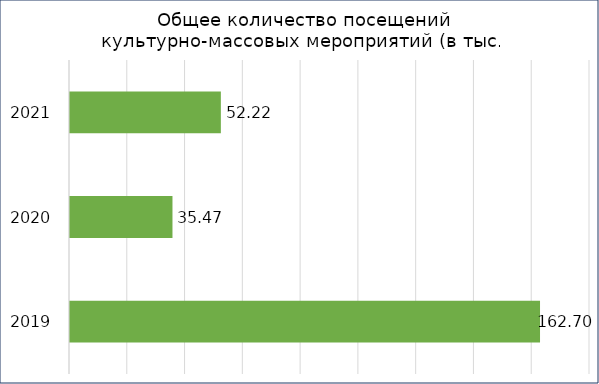
| Category | Series 2 |
|---|---|
| 2019.0 | 162.7 |
| 2020.0 | 35.47 |
| 2021.0 | 52.22 |